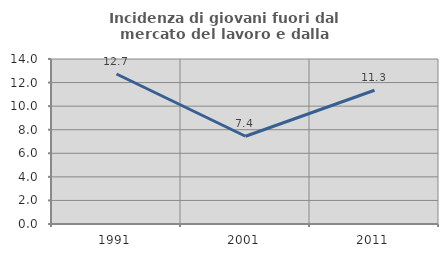
| Category | Incidenza di giovani fuori dal mercato del lavoro e dalla formazione  |
|---|---|
| 1991.0 | 12.727 |
| 2001.0 | 7.447 |
| 2011.0 | 11.346 |